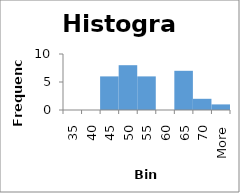
| Category | Frequency |
|---|---|
| 35 | 0 |
| 40 | 0 |
| 45 | 6 |
| 50 | 8 |
| 55 | 6 |
| 60 | 0 |
| 65 | 7 |
| 70 | 2 |
| More | 1 |